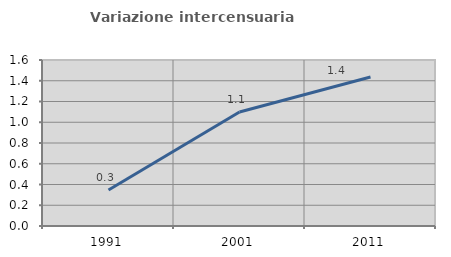
| Category | Variazione intercensuaria annua |
|---|---|
| 1991.0 | 0.348 |
| 2001.0 | 1.099 |
| 2011.0 | 1.436 |